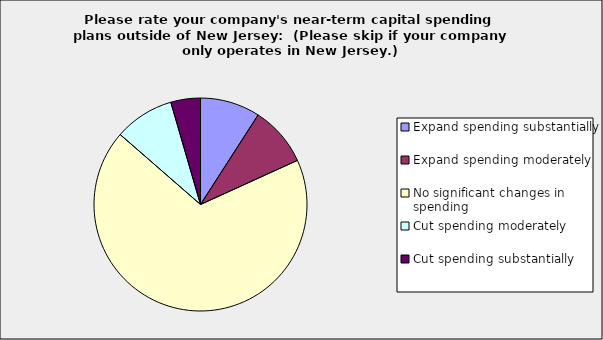
| Category | Series 0 |
|---|---|
| Expand spending substantially | 0.091 |
| Expand spending moderately | 0.091 |
| No significant changes in spending | 0.682 |
| Cut spending moderately | 0.091 |
| Cut spending substantially | 0.045 |